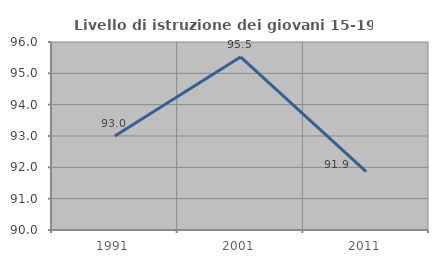
| Category | Livello di istruzione dei giovani 15-19 anni |
|---|---|
| 1991.0 | 93 |
| 2001.0 | 95.522 |
| 2011.0 | 91.86 |